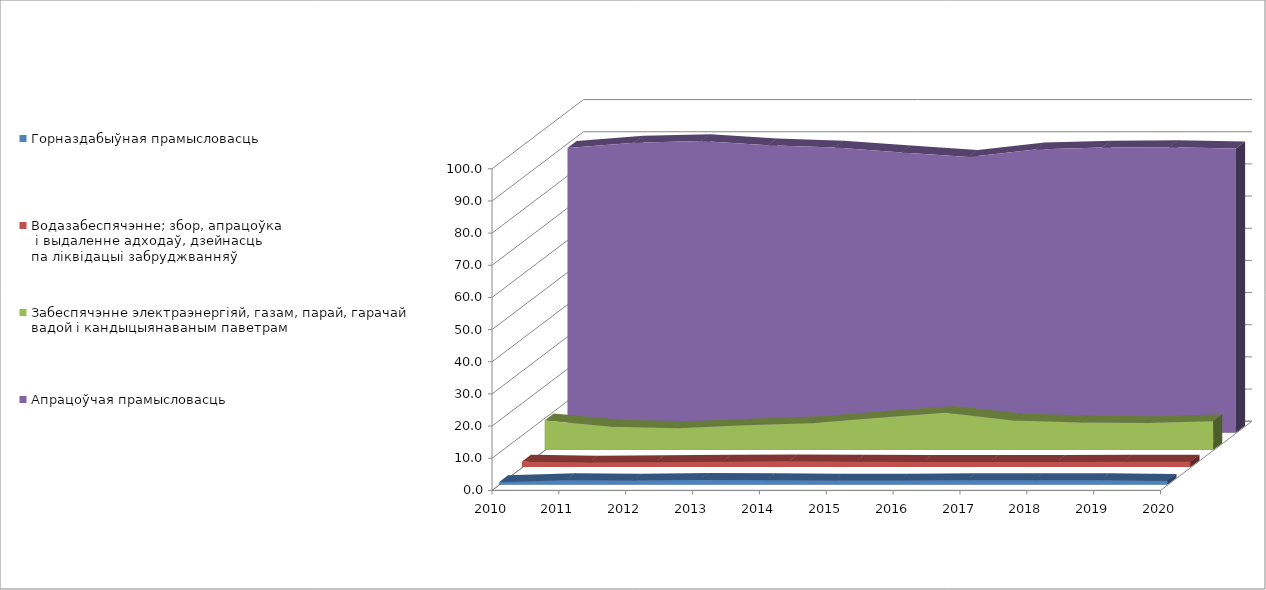
| Category | Горназдабыўная прамысловасць | Водазабеспячэнне; збор, апрацоўка
 і выдаленне адходаў, дзейнасць 
па ліквідацыі забруджванняў | Забеспячэнне электраэнергіяй, газам, парай, гарачай вадой і кандыцыянаваным паветрам | Апрацоўчая прамысловасць |
|---|---|---|---|---|
| 0 | 0.7 | 1.7 | 9.1 | 88.5 |
| 1 | 1.3 | 1.4 | 7.2 | 90.1 |
| 2 | 1.2 | 1.5 | 6.7 | 90.6 |
| 3 | 1.4 | 1.7 | 7.6 | 89.3 |
| 4 | 1.33 | 1.8 | 8.28 | 88.6 |
| 5 | 1.2 | 1.7 | 10 | 87.1 |
| 6 | 1.2 | 1.6 | 11.5 | 85.7 |
| 7 | 1.3 | 1.6 | 9.1 | 88 |
| 8 | 1.3 | 1.6 | 8.5 | 88.6 |
| 9 | 1.3 | 1.7 | 8.3 | 88.7 |
| 10 | 1.1 | 1.7 | 8.9 | 88.3 |